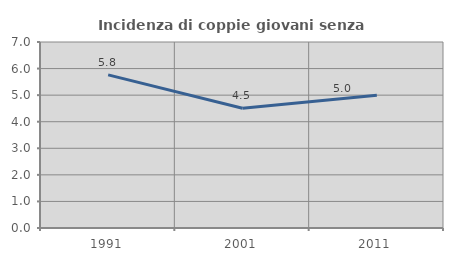
| Category | Incidenza di coppie giovani senza figli |
|---|---|
| 1991.0 | 5.762 |
| 2001.0 | 4.508 |
| 2011.0 | 4.998 |